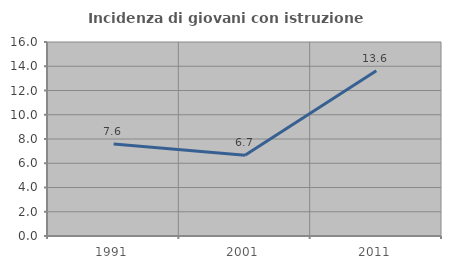
| Category | Incidenza di giovani con istruzione universitaria |
|---|---|
| 1991.0 | 7.595 |
| 2001.0 | 6.667 |
| 2011.0 | 13.636 |